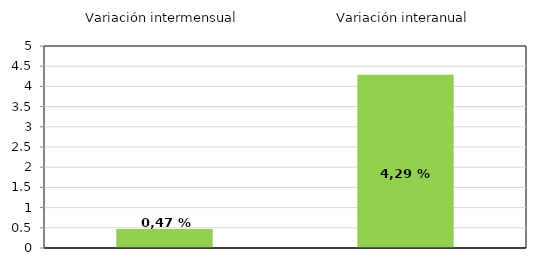
| Category | Series 0 |
|---|---|
| 0 | 0.469 |
| 1 | 4.291 |